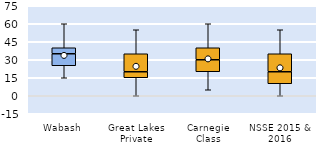
| Category | 25th | 50th | 75th |
|---|---|---|---|
| Wabash | 25 | 10 | 5 |
| Great Lakes Private | 15 | 5 | 15 |
| Carnegie Class | 20 | 10 | 10 |
| NSSE 2015 & 2016 | 10 | 10 | 15 |